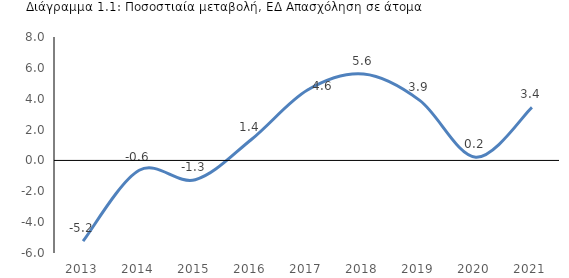
| Category | Απασχόληση, ΕΔ (άτομα, Στατιστική Υπηρεσία) % |
|---|---|
| 2013.0 | -5.23 |
| 2014.0 | -0.64 |
| 2015.0 | -1.251 |
| 2016.0 | 1.356 |
| 2017.0 | 4.562 |
| 2018.0 | 5.599 |
| 2019.0 | 3.891 |
| 2020.0 | 0.21 |
| 2021.0 | 3.441 |